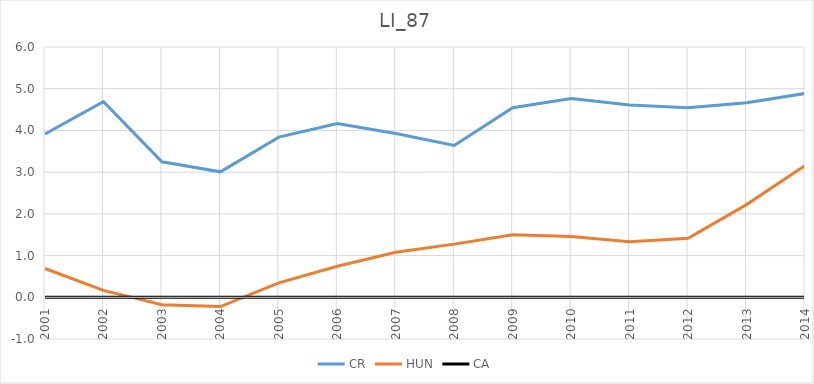
| Category | CR | HUN | CA |
|---|---|---|---|
| 2001.0 | 3.914 | 0.69 | 0 |
| 2002.0 | 4.691 | 0.166 | 0 |
| 2003.0 | 3.249 | -0.177 | 0 |
| 2004.0 | 3.008 | -0.222 | 0 |
| 2005.0 | 3.839 | 0.346 | 0 |
| 2006.0 | 4.165 | 0.744 | 0 |
| 2007.0 | 3.925 | 1.081 | 0 |
| 2008.0 | 3.64 | 1.274 | 0 |
| 2009.0 | 4.544 | 1.5 | 0 |
| 2010.0 | 4.765 | 1.457 | 0 |
| 2011.0 | 4.611 | 1.33 | 0 |
| 2012.0 | 4.544 | 1.413 | 0 |
| 2013.0 | 4.662 | 2.222 | 0 |
| 2014.0 | 4.886 | 3.157 | 0 |